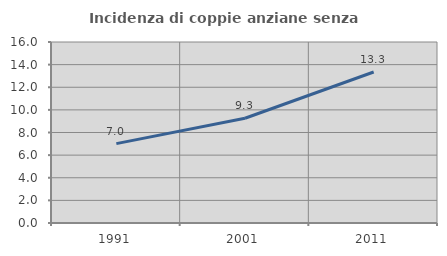
| Category | Incidenza di coppie anziane senza figli  |
|---|---|
| 1991.0 | 7.015 |
| 2001.0 | 9.261 |
| 2011.0 | 13.347 |